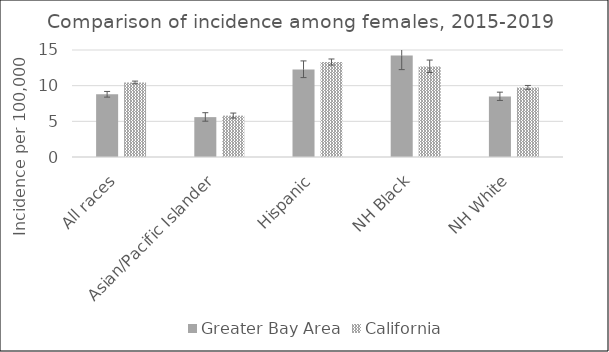
| Category | Greater Bay Area | California | SEER 18 |
|---|---|---|---|
| All races | 8.78 | 10.45 |  |
| Asian/Pacific Islander | 5.59 | 5.8 |  |
| Hispanic | 12.26 | 13.31 |  |
| NH Black | 14.24 | 12.7 |  |
| NH White | 8.49 | 9.75 |  |